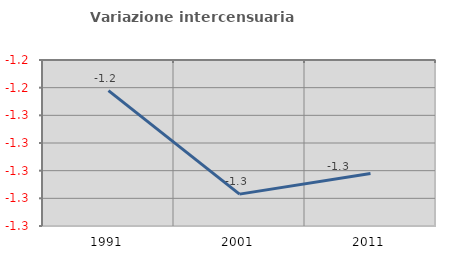
| Category | Variazione intercensuaria annua |
|---|---|
| 1991.0 | -1.246 |
| 2001.0 | -1.283 |
| 2011.0 | -1.276 |